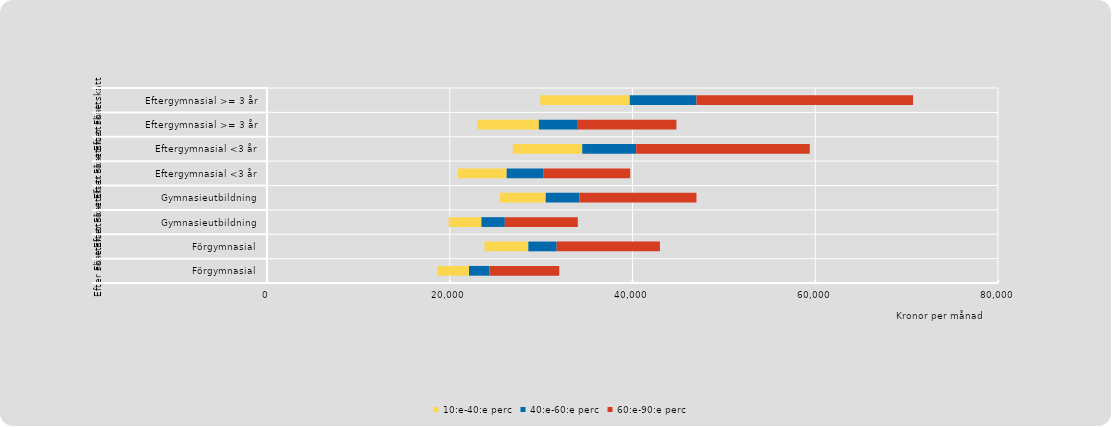
| Category | Series 0 | 10:e-40:e perc | 40:e-60:e perc | 60:e-90:e perc |
|---|---|---|---|---|
| 0 | 18669 | 3437 | 2220 | 7660 |
| 1 | 23800 | 4800 | 3100 | 11300 |
| 2 | 19886 | 3580 | 2560 | 7989 |
| 3 | 25500 | 5000 | 3700 | 12800 |
| 4 | 20889 | 5340 | 3996 | 9528 |
| 5 | 26900 | 7600 | 5900 | 19000 |
| 6 | 23036 | 6715 | 4264 | 10792 |
| 7 | 29900 | 9800 | 7300 | 23700 |